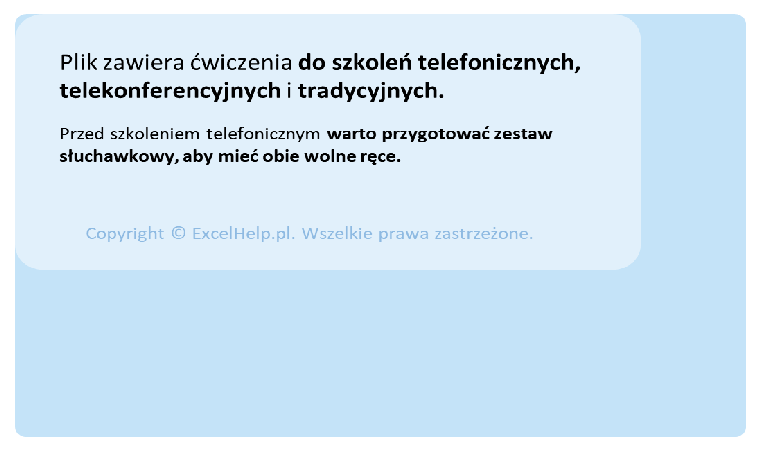
| Category | Series 0 | Series 1 |
|---|---|---|
| 0 | 1 | 0 |